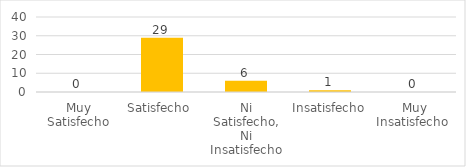
| Category | Series 5 |
|---|---|
| Muy Satisfecho | 0 |
| Satisfecho  | 29 |
| Ni Satisfecho, Ni Insatisfecho | 6 |
| Insatisfecho | 1 |
| Muy Insatisfecho  | 0 |